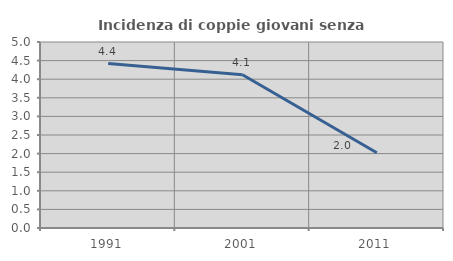
| Category | Incidenza di coppie giovani senza figli |
|---|---|
| 1991.0 | 4.42 |
| 2001.0 | 4.118 |
| 2011.0 | 2.021 |